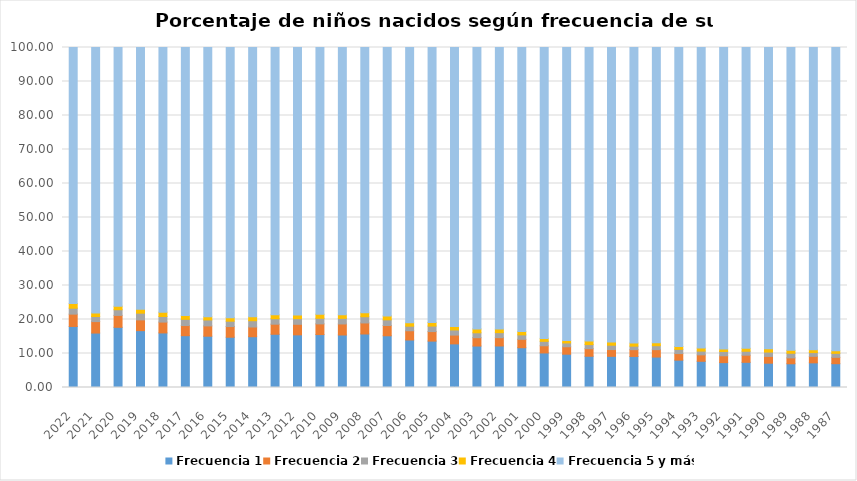
| Category | Frecuencia 1 | Frecuencia 2 | Frecuencia 3 | Frecuencia 4 | Frecuencia 5 y más |
|---|---|---|---|---|---|
| 2022.0 | 17.955 | 3.626 | 1.736 | 1.38 | 75.303 |
| 2021.0 | 16.011 | 3.376 | 1.497 | 1.055 | 78.06 |
| 2020.0 | 17.704 | 3.501 | 1.665 | 1.043 | 76.087 |
| 2019.0 | 16.722 | 3.165 | 1.972 | 1.155 | 76.987 |
| 2018.0 | 16.047 | 3.193 | 1.644 | 1.272 | 77.845 |
| 2017.0 | 15.24 | 2.986 | 1.831 | 1.116 | 78.827 |
| 2016.0 | 15.087 | 3.027 | 1.752 | 0.939 | 79.195 |
| 2015.0 | 14.786 | 3.137 | 1.575 | 1.019 | 79.482 |
| 2014.0 | 14.932 | 2.864 | 1.843 | 1.162 | 79.199 |
| 2013.0 | 15.656 | 2.965 | 1.609 | 1.157 | 78.613 |
| 2012.0 | 15.485 | 3.107 | 1.661 | 1.102 | 78.645 |
| 2010.0 | 15.565 | 3.145 | 1.644 | 1.207 | 78.438 |
| 2009.0 | 15.44 | 3.247 | 1.651 | 1.05 | 78.612 |
| 2008.0 | 15.739 | 3.246 | 1.833 | 1.148 | 78.035 |
| 2007.0 | 15.213 | 3.018 | 1.67 | 1.165 | 78.934 |
| 2006.0 | 13.972 | 2.72 | 1.347 | 0.984 | 80.977 |
| 2005.0 | 13.643 | 2.804 | 1.62 | 1.074 | 80.858 |
| 2004.0 | 12.829 | 2.586 | 1.505 | 0.992 | 82.088 |
| 2003.0 | 12.19 | 2.457 | 1.443 | 1.136 | 82.775 |
| 2002.0 | 12.211 | 2.445 | 1.474 | 1.056 | 82.814 |
| 2001.0 | 11.696 | 2.472 | 1.311 | 0.978 | 83.544 |
| 2000.0 | 10.162 | 2.114 | 1.299 | 0.873 | 85.552 |
| 1999.0 | 9.791 | 2.193 | 1.115 | 0.758 | 86.142 |
| 1998.0 | 9.189 | 2.229 | 1.202 | 1.047 | 86.333 |
| 1997.0 | 9.168 | 1.993 | 1.28 | 0.909 | 86.65 |
| 1996.0 | 9.132 | 1.996 | 1.027 | 0.907 | 86.937 |
| 1995.0 | 8.958 | 2.175 | 1.161 | 0.857 | 86.85 |
| 1994.0 | 8.047 | 1.924 | 1.255 | 0.844 | 87.93 |
| 1993.0 | 7.706 | 1.899 | 1.101 | 0.878 | 88.417 |
| 1992.0 | 7.322 | 2.008 | 1.266 | 0.735 | 88.67 |
| 1991.0 | 7.41 | 2.094 | 1.155 | 0.867 | 88.474 |
| 1990.0 | 7.157 | 1.99 | 1.274 | 0.975 | 88.604 |
| 1989.0 | 6.978 | 1.737 | 1.361 | 0.853 | 89.071 |
| 1988.0 | 7.25 | 1.919 | 1.098 | 0.802 | 88.93 |
| 1987.0 | 7.001 | 1.876 | 1.168 | 0.756 | 89.198 |